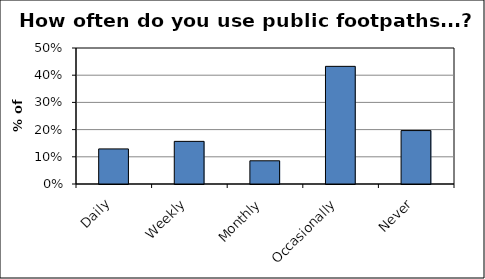
| Category | Series 0 |
|---|---|
| Daily | 0.129 |
| Weekly | 0.157 |
| Monthly | 0.085 |
| Occasionally | 0.433 |
| Never | 0.196 |